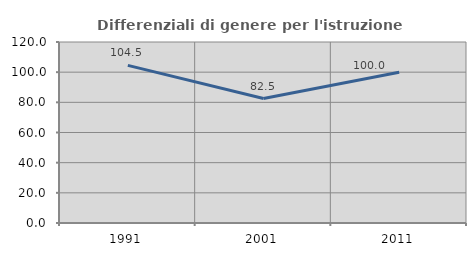
| Category | Differenziali di genere per l'istruzione superiore |
|---|---|
| 1991.0 | 104.523 |
| 2001.0 | 82.489 |
| 2011.0 | 99.979 |